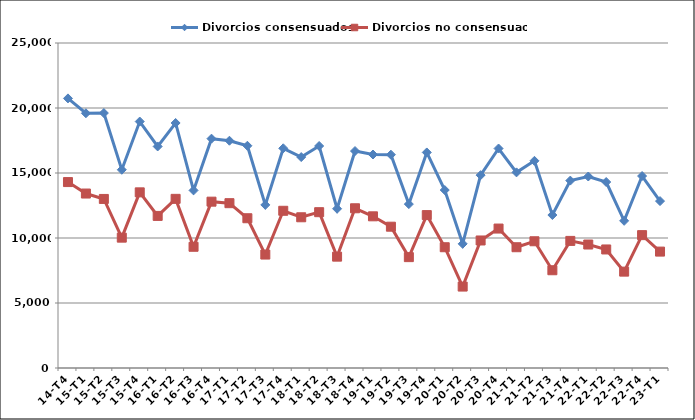
| Category | Divorcios consensuados | Divorcios no consensuados |
|---|---|---|
| 14-T4 | 20739 | 14302 |
| 15-T1 | 19595 | 13420 |
| 15-T2 | 19612 | 13004 |
| 15-T3 | 15249 | 10027 |
| 15-T4 | 18958 | 13512 |
| 16-T1 | 17041 | 11699 |
| 16-T2 | 18847 | 13011 |
| 16-T3 | 13660 | 9325 |
| 16-T4 | 17641 | 12795 |
| 17-T1 | 17483 | 12679 |
| 17-T2 | 17095 | 11520 |
| 17-T3 | 12545 | 8727 |
| 17-T4 | 16901 | 12093 |
| 18-T1 | 16226 | 11594 |
| 18-T2 | 17077 | 11986 |
| 18-T3 | 12249 | 8566 |
| 18-T4 | 16689 | 12287 |
| 19-T1 | 16423 | 11668 |
| 19-T2 | 16409 | 10869 |
| 19-T3 | 12607 | 8528 |
| 19-T4 | 16581 | 11761 |
| 20-T1 | 13690 | 9290 |
| 20-T2 | 9552 | 6264 |
| 20-T3 | 14835 | 9809 |
| 20-T4 | 16883 | 10727 |
| 21-T1 | 15048 | 9290 |
| 21-T2 | 15937 | 9750 |
| 21-T3 | 11767 | 7520 |
| 21-T4 | 14416 | 9777 |
| 22-T1 | 14730 | 9498 |
| 22-T2 | 14306 | 9118 |
| 22-T3 | 11321 | 7413 |
| 22-T4 | 14766 | 10221 |
| 23-T1 | 12839 | 8954 |